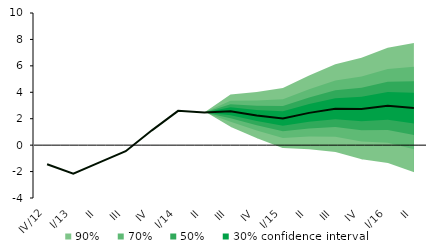
| Category | Střed předpovědi |
|---|---|
| IV/12 | -1.447 |
| I/13 | -2.167 |
| II | -1.306 |
| III | -0.459 |
| IV | 1.121 |
| I/14 | 2.596 |
| II | 2.479 |
| III | 2.566 |
| IV | 2.244 |
| I/15 | 2.009 |
| II | 2.441 |
| III | 2.761 |
| IV | 2.734 |
| I/16 | 2.972 |
| II | 2.804 |